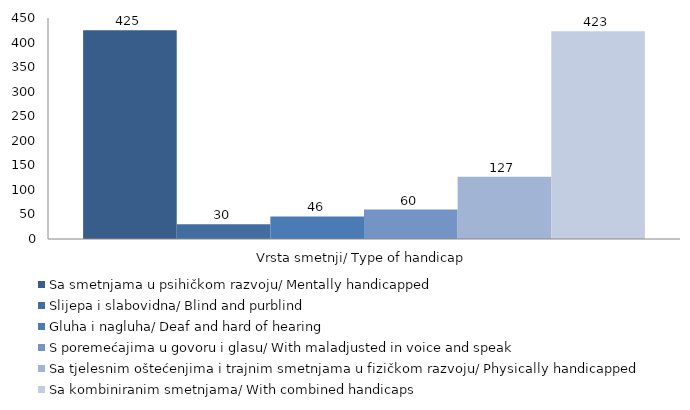
| Category | Sa smetnjama u psihičkom razvoju/ Mentally handicapped  | Slijepa i slabovidna/ Blind and purblind | Gluha i nagluha/ Deaf and hard of hearing | S poremećajima u govoru i glasu/ With maladjusted in voice and speak | Sa tjelesnim oštećenjima i trajnim smetnjama u fizičkom razvoju/ Physically handicapped | Sa kombiniranim smetnjama/ With combined handicaps |
|---|---|---|---|---|---|---|
| 0 | 425 | 30 | 46 | 60 | 127 | 423 |